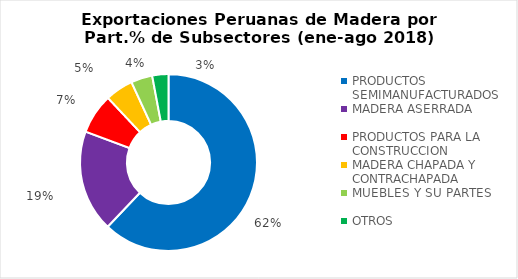
| Category | Part.% 2018 |
|---|---|
| PRODUCTOS SEMIMANUFACTURADOS | 0.621 |
| MADERA ASERRADA | 0.186 |
| PRODUCTOS PARA LA CONSTRUCCION | 0.073 |
| MADERA CHAPADA Y CONTRACHAPADA | 0.051 |
| MUEBLES Y SU PARTES | 0.039 |
| OTROS | 0.03 |